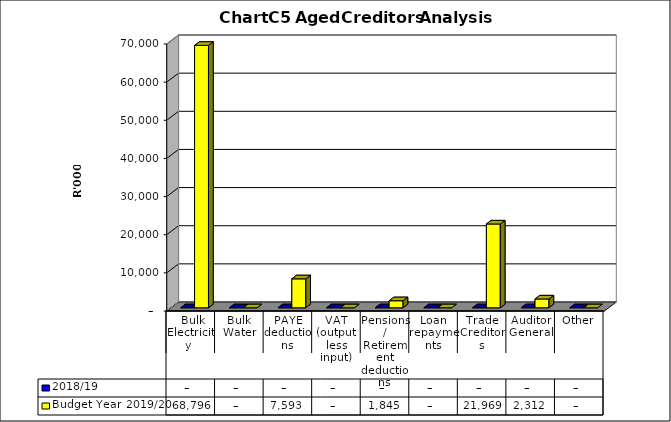
| Category | 2018/19 | Budget Year 2019/20 |
|---|---|---|
|  Bulk Electricity  | 0 | 68796337 |
| Bulk Water | 0 | 0 |
| PAYE deductions | 0 | 7592728 |
| VAT (output less input) | 0 | 0 |
| Pensions / Retirement deductions | 0 | 1844871 |
| Loan repayments | 0 | 0 |
| Trade Creditors | 0 | 21969194 |
| Auditor General | 0 | 2312131 |
| Other | 0 | 0 |